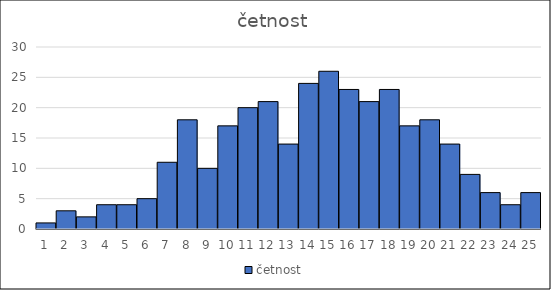
| Category | četnost |
|---|---|
| 0 | 1 |
| 1 | 3 |
| 2 | 2 |
| 3 | 4 |
| 4 | 4 |
| 5 | 5 |
| 6 | 11 |
| 7 | 18 |
| 8 | 10 |
| 9 | 17 |
| 10 | 20 |
| 11 | 21 |
| 12 | 14 |
| 13 | 24 |
| 14 | 26 |
| 15 | 23 |
| 16 | 21 |
| 17 | 23 |
| 18 | 17 |
| 19 | 18 |
| 20 | 14 |
| 21 | 9 |
| 22 | 6 |
| 23 | 4 |
| 24 | 6 |